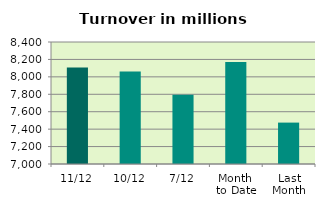
| Category | Series 0 |
|---|---|
| 11/12 | 8108.732 |
| 10/12 | 8060.988 |
| 7/12 | 7793.352 |
| Month 
to Date | 8170.074 |
| Last
Month | 7475.09 |